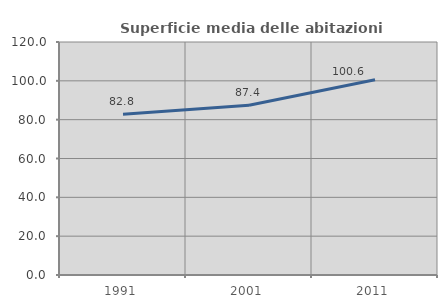
| Category | Superficie media delle abitazioni occupate |
|---|---|
| 1991.0 | 82.775 |
| 2001.0 | 87.387 |
| 2011.0 | 100.596 |